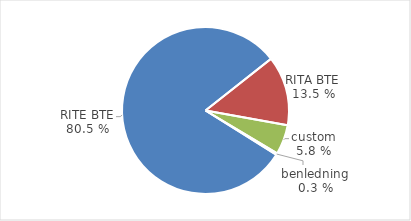
| Category | Series 0 |
|---|---|
| RITE BTE | 0.805 |
| RITA BTE | 0.135 |
| custom | 0.058 |
| benledning | 0.003 |